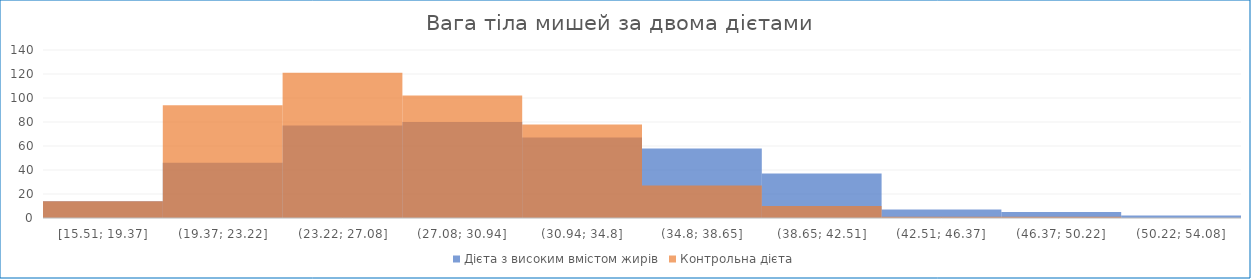
| Category | Дієта з високим вмістом жирів | Контрольна дієта |
|---|---|---|
| [15.51; 19.37] | 14 | 14 |
| (19.37; 23.22] | 46 | 94 |
| (23.22; 27.08] | 77 | 121 |
| (27.08; 30.94] | 80 | 102 |
| (30.94; 34.8] | 67 | 78 |
| (34.8; 38.65] | 58 | 27 |
| (38.65; 42.51] | 37 | 10 |
| (42.51; 46.37] | 7 | 1 |
| (46.37; 50.22] | 5 | 1 |
| (50.22; 54.08] | 2 | 0 |